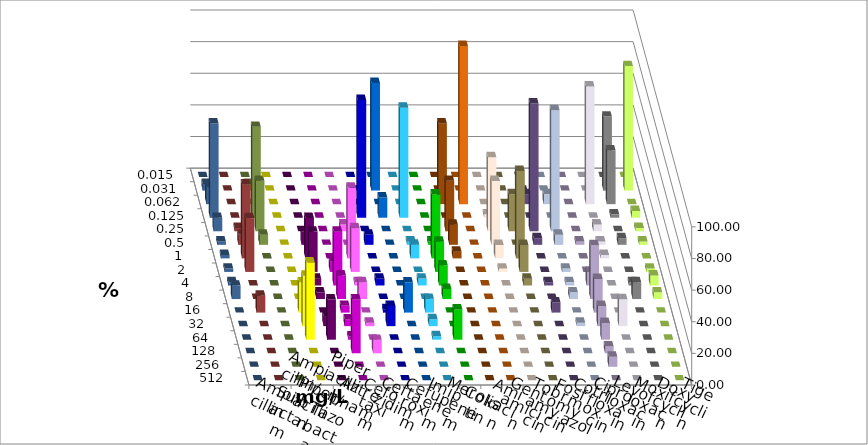
| Category | Ampicillin | Ampicillin/ Sulbactam | Piperacillin | Piperacillin/ Tazobactam | Aztreonam | Cefotaxim | Ceftazidim | Cefuroxim | Imipenem | Meropenem | Colistin | Amikacin | Gentamicin | Tobramycin | Fosfomycin | Cotrimoxazol | Ciprofloxacin | Levofloxacin | Moxifloxacin | Doxycyclin | Tigecyclin |
|---|---|---|---|---|---|---|---|---|---|---|---|---|---|---|---|---|---|---|---|---|---|
| 0.015 | 0 | 0 | 0 | 0 | 0 | 0 | 0 | 0 | 0 | 0 | 0 | 0 | 0 | 0 | 0 | 0 | 0 | 0 | 0 | 0 | 0 |
| 0.031 | 0 | 0 | 0 | 0 | 0 | 68.085 | 0 | 0 | 0 | 0 | 0 | 0 | 0 | 0 | 0 | 0 | 46.809 | 78.723 | 4.255 | 0 | 4.255 |
| 0.062 | 0 | 0 | 0 | 0 | 0 | 0 | 0 | 0 | 51.064 | 100 | 0 | 0 | 6.383 | 6.383 | 0 | 74.468 | 34.043 | 0 | 10.638 | 0 | 0 |
| 0.125 | 0 | 0 | 0 | 0 | 74.468 | 12.766 | 69.565 | 0 | 0 | 0 | 2.128 | 0 | 0 | 0 | 0 | 0 | 2.128 | 4.255 | 59.574 | 0 | 57.447 |
| 0.25 | 0 | 0 | 0 | 4.255 | 0 | 0 | 0 | 0 | 31.915 | 0 | 46.809 | 23.404 | 80.851 | 76.596 | 0 | 4.255 | 0 | 2.128 | 8.511 | 2.128 | 31.915 |
| 0.5 | 0 | 8.511 | 0 | 0 | 6.383 | 0 | 2.174 | 2.128 | 12.766 | 0 | 40.426 | 0 | 4.255 | 6.383 | 2.128 | 2.128 | 4.255 | 2.128 | 2.128 | 6.383 | 6.383 |
| 1.0 | 0 | 25.532 | 0 | 44.681 | 0 | 0 | 8.696 | 40.426 | 4.255 | 0 | 8.511 | 55.319 | 0 | 0 | 0 | 2.128 | 0 | 0 | 2.128 | 46.809 | 0 |
| 2.0 | 0 | 25.532 | 6.383 | 27.66 | 0 | 0 | 0 | 19.149 | 0 | 0 | 2.128 | 17.021 | 0 | 2.128 | 0 | 0 | 0 | 2.128 | 2.128 | 34.043 | 0 |
| 4.0 | 0 | 4.255 | 34.043 | 2.128 | 4.255 | 0 | 4.348 | 12.766 | 0 | 0 | 0 | 4.255 | 2.128 | 2.128 | 8.511 | 0 | 2.128 | 6.383 | 2.128 | 0 | 0 |
| 8.0 | 0 | 4.255 | 14.894 | 10.638 | 0 | 0 | 0 | 6.383 | 0 | 0 | 0 | 0 | 0 | 4.255 | 34.043 | 0 | 10.638 | 4.255 | 8.511 | 0 | 0 |
| 16.0 | 19.149 | 0 | 4.255 | 0 | 2.128 | 19.149 | 8.696 | 0 | 0 | 0 | 0 | 0 | 6.383 | 0 | 21.277 | 0 | 0 | 0 | 0 | 10.638 | 0 |
| 32.0 | 31.915 | 6.383 | 4.255 | 2.128 | 12.766 | 0 | 4.348 | 0 | 0 | 0 | 0 | 0 | 0 | 2.128 | 12.766 | 17.021 | 0 | 0 | 0 | 0 | 0 |
| 64.0 | 48.936 | 25.532 | 2.128 | 0 | 0 | 0 | 2.174 | 19.149 | 0 | 0 | 0 | 0 | 0 | 0 | 10.638 | 0 | 0 | 0 | 0 | 0 | 0 |
| 128.0 | 0 | 0 | 34.043 | 8.511 | 0 | 0 | 0 | 0 | 0 | 0 | 0 | 0 | 0 | 0 | 4.255 | 0 | 0 | 0 | 0 | 0 | 0 |
| 256.0 | 0 | 0 | 0 | 0 | 0 | 0 | 0 | 0 | 0 | 0 | 0 | 0 | 0 | 0 | 6.383 | 0 | 0 | 0 | 0 | 0 | 0 |
| 512.0 | 0 | 0 | 0 | 0 | 0 | 0 | 0 | 0 | 0 | 0 | 0 | 0 | 0 | 0 | 0 | 0 | 0 | 0 | 0 | 0 | 0 |